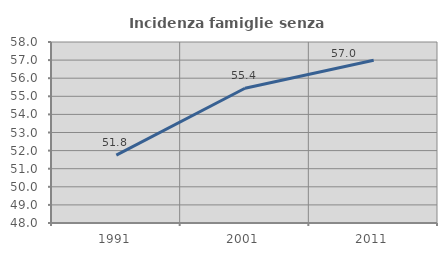
| Category | Incidenza famiglie senza nuclei |
|---|---|
| 1991.0 | 51.754 |
| 2001.0 | 55.446 |
| 2011.0 | 56.989 |